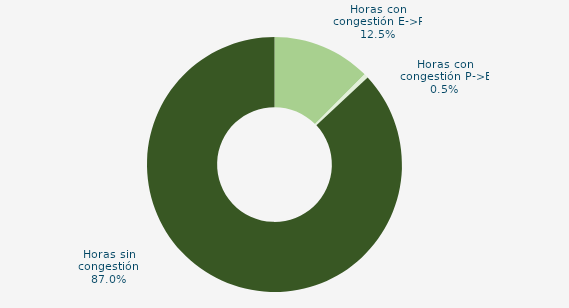
| Category | Horas con congestión E->P |
|---|---|
| Horas con congestión E->P | 12.5 |
| Horas con congestión P->E | 0.538 |
| Horas sin congestión | 86.962 |